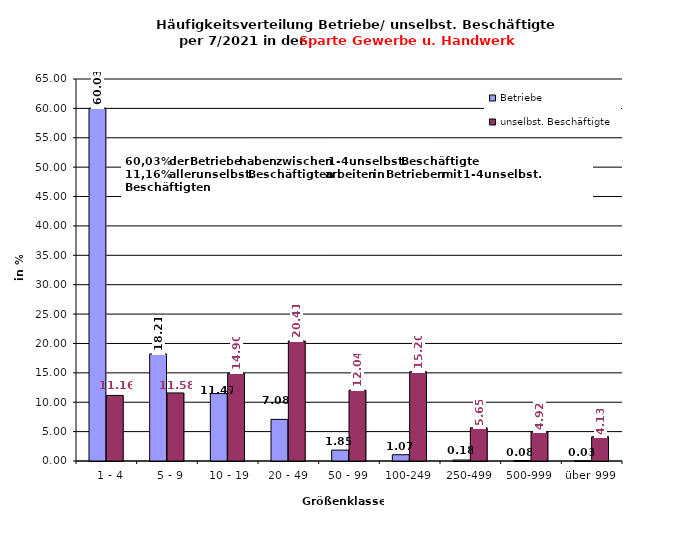
| Category | Betriebe | unselbst. Beschäftigte |
|---|---|---|
|   1 - 4 | 60.027 | 11.163 |
|   5 - 9 | 18.213 | 11.583 |
|  10 - 19 | 11.47 | 14.902 |
| 20 - 49 | 7.08 | 20.408 |
| 50 - 99 | 1.854 | 12.042 |
| 100-249 | 1.065 | 15.197 |
| 250-499 | 0.175 | 5.652 |
| 500-999 | 0.081 | 4.923 |
| über 999 | 0.034 | 4.13 |